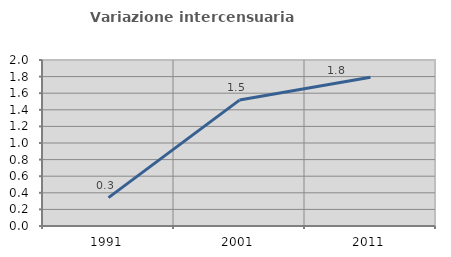
| Category | Variazione intercensuaria annua |
|---|---|
| 1991.0 | 0.341 |
| 2001.0 | 1.517 |
| 2011.0 | 1.793 |